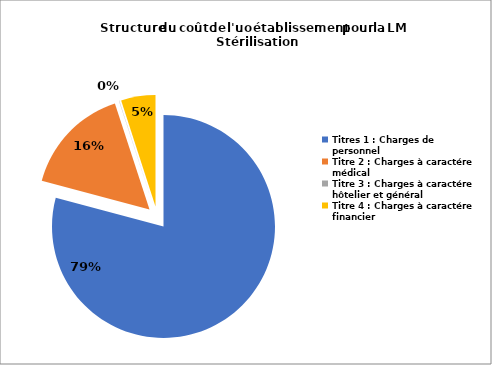
| Category | Series 0 |
|---|---|
| Titres 1 : Charges de personnel | 0.791 |
| Titre 2 : Charges à caractére médical | 0.158 |
| Titre 3 : Charges à caractére hôtelier et général | 0 |
| Titre 4 : Charges à caractére financier | 0.05 |